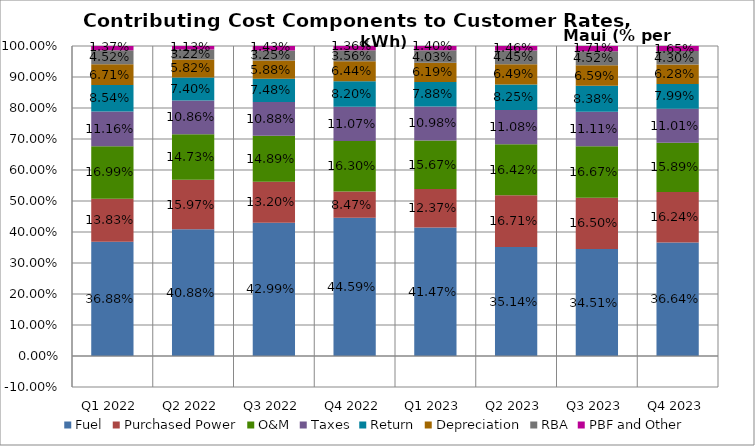
| Category | Fuel | Purchased Power | O&M | Taxes | Return | Depreciation | RBA | PBF and Other |
|---|---|---|---|---|---|---|---|---|
| Q1 2022 | 0.369 | 0.138 | 0.17 | 0.112 | 0.085 | 0.067 | 0.045 | 0.014 |
| Q2 2022 | 0.409 | 0.16 | 0.147 | 0.109 | 0.074 | 0.058 | 0.032 | 0.011 |
| Q3 2022 | 0.43 | 0.132 | 0.149 | 0.109 | 0.075 | 0.059 | 0.033 | 0.014 |
| Q4 2022 | 0.446 | 0.085 | 0.163 | 0.111 | 0.082 | 0.064 | 0.036 | 0.014 |
| Q1 2023 | 0.415 | 0.124 | 0.157 | 0.11 | 0.079 | 0.062 | 0.04 | 0.014 |
| Q2 2023 | 0.351 | 0.167 | 0.164 | 0.111 | 0.083 | 0.065 | 0.044 | 0.015 |
| Q3 2023 | 0.345 | 0.165 | 0.167 | 0.111 | 0.084 | 0.066 | 0.045 | 0.017 |
| Q4 2023 | 0.366 | 0.162 | 0.159 | 0.11 | 0.08 | 0.063 | 0.043 | 0.016 |